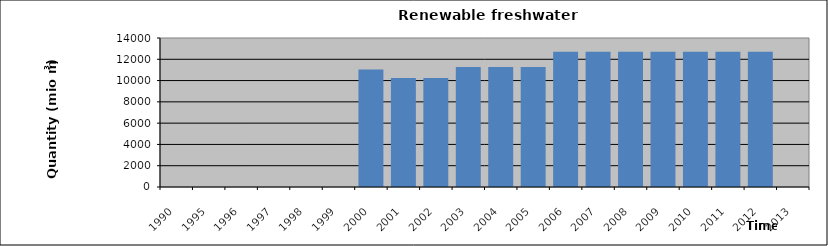
| Category | 1990 1995 1996 1997 1998 1999 2000 2001 2002 2003 2004 2005 2006 2007 2008 2009 2010 2011 2012 2013 |
|---|---|
| 1990.0 | 0 |
| 1995.0 | 0 |
| 1996.0 | 0 |
| 1997.0 | 0 |
| 1998.0 | 0 |
| 1999.0 | 0 |
| 2000.0 | 11050 |
| 2001.0 | 10245 |
| 2002.0 | 10245 |
| 2003.0 | 11276 |
| 2004.0 | 11276 |
| 2005.0 | 11276 |
| 2006.0 | 12707 |
| 2007.0 | 12707 |
| 2008.0 | 12707 |
| 2009.0 | 12707 |
| 2010.0 | 12707 |
| 2011.0 | 12707 |
| 2012.0 | 12707 |
| 2013.0 | 0 |